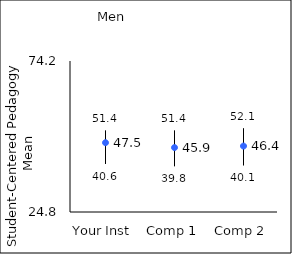
| Category | 25th percentile | 75th percentile | Mean |
|---|---|---|---|
| Your Inst | 40.6 | 51.4 | 47.48 |
| Comp 1 | 39.8 | 51.4 | 45.88 |
| Comp 2 | 40.1 | 52.1 | 46.37 |